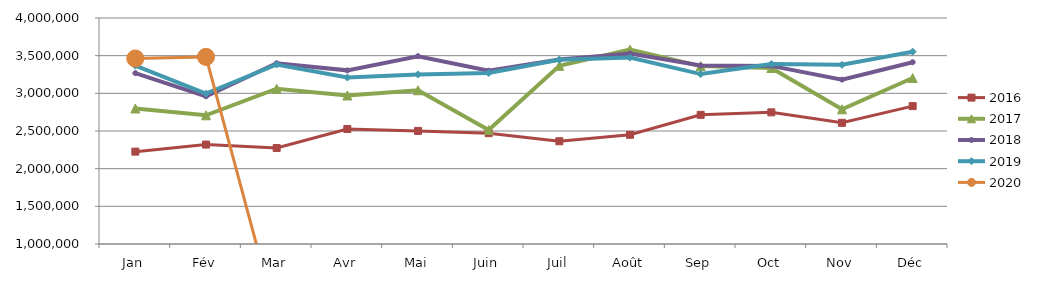
| Category | 2015 | 2016 | 2017 | 2018 | 2019 | 2020 |
|---|---|---|---|---|---|---|
| Jan |  | 2226093.309 | 2798915.391 | 3268127.156 | 3367510.542 | 3462441.736 |
| Fév |  | 2320135.002 | 2708507.11 | 2960518.709 | 2995707.194 | 3483671.962 |
| Mar |  | 2274111.99 | 3061215.361 | 3399788.443 | 3382590.899 | 0 |
| Avr |  | 2526794.87 | 2970911.094 | 3304906.324 | 3209954.832 | 0 |
| Mai |  | 2500868.782 | 3040805.262 | 3492911.082 | 3251146.092 | 0 |
| Juin |  | 2471115.702 | 2513480.318 | 3300924.802 | 3269085.474 | 0 |
| Juil |  | 2363852.978 | 3365511.031 | 3448603.566 | 3445052.713 | 0 |
| Août |  | 2449927.953 | 3580436.797 | 3528173.012 | 3474993.525 | 0 |
| Sep |  | 2714390.875 | 3361524.335 | 3369626.193 | 3255644.054 | 0 |
| Oct |  | 2747632.929 | 3335934.501 | 3364260.879 | 3388972.2 | 0 |
| Nov |  | 2608583.302 | 2787992.168 | 3181888.576 | 3378477.919 | 0 |
| Déc |  | 2830164.13 | 3203732.398 | 3413454.996 | 3552894.26 | 0 |